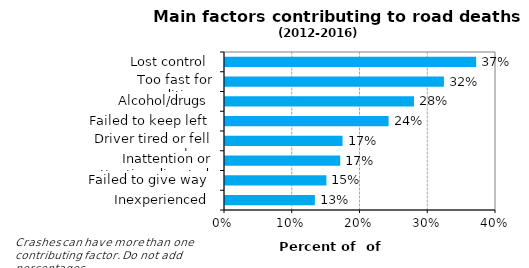
| Category | Series 1 |
|---|---|
| Lost control | 0.371 |
| Too fast for conditions  | 0.323 |
| Alcohol/drugs | 0.279 |
| Failed to keep left | 0.241 |
| Driver tired or fell asleep | 0.173 |
| Inattention or attention diverted | 0.17 |
| Failed to give way | 0.15 |
| Inexperienced | 0.133 |